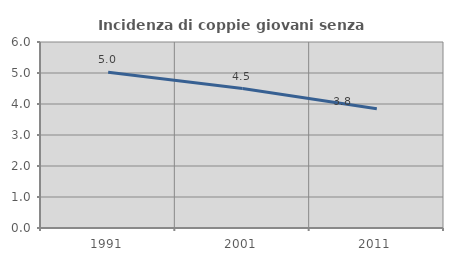
| Category | Incidenza di coppie giovani senza figli |
|---|---|
| 1991.0 | 5.024 |
| 2001.0 | 4.5 |
| 2011.0 | 3.846 |